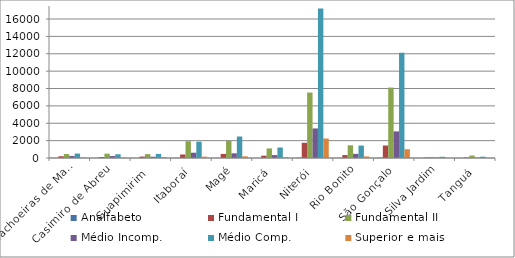
| Category | Analfabeto | Fundamental I | Fundamental II | Médio Incomp. | Médio Comp. | Superior e mais |
|---|---|---|---|---|---|---|
| Cachoeiras de Macacu | 6 | 200 | 451 | 236 | 511 | 53 |
| Casimiro de Abreu | 5 | 115 | 495 | 226 | 430 | 46 |
| Guapimirim  | 2 | 164 | 447 | 145 | 467 | 107 |
| Itaboraí | 24 | 404 | 1931 | 606 | 1879 | 153 |
| Magé | 5 | 466 | 1987 | 538 | 2475 | 193 |
| Maricá | 7 | 268 | 1101 | 335 | 1208 | 78 |
| Niterói | 39 | 1750 | 7538 | 3402 | 17202 | 2241 |
| Rio Bonito | 12 | 334 | 1461 | 477 | 1429 | 183 |
| São Gonçalo | 36 | 1439 | 8109 | 3064 | 12121 | 1012 |
| Silva Jardim | 2 | 49 | 120 | 39 | 139 | 10 |
| Tanguá | 0 | 53 | 284 | 34 | 151 | 18 |